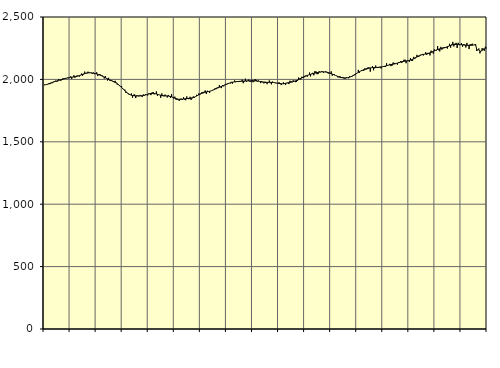
| Category | Piggar | Series 1 |
|---|---|---|
| nan | 1958.3 | 1954.32 |
| 87.0 | 1956.4 | 1957.07 |
| 87.0 | 1956.2 | 1959.35 |
| 87.0 | 1960.8 | 1962.17 |
| 87.0 | 1969.6 | 1965.12 |
| 87.0 | 1961.7 | 1968.23 |
| 87.0 | 1974.1 | 1971.53 |
| 87.0 | 1969.4 | 1974.83 |
| 87.0 | 1980.9 | 1978.11 |
| 87.0 | 1985.4 | 1981.26 |
| 87.0 | 1989.8 | 1984.26 |
| 87.0 | 1982.9 | 1987.09 |
| nan | 1983.1 | 1989.77 |
| 88.0 | 2001.6 | 1992.28 |
| 88.0 | 1995.8 | 1994.78 |
| 88.0 | 1988.4 | 1997.3 |
| 88.0 | 1997.2 | 1999.79 |
| 88.0 | 2007.8 | 2002.26 |
| 88.0 | 2002.4 | 2004.73 |
| 88.0 | 2011.5 | 2007.09 |
| 88.0 | 2008.2 | 2009.28 |
| 88.0 | 2012.8 | 2011.26 |
| 88.0 | 2008.5 | 2013.05 |
| 88.0 | 2018.4 | 2014.61 |
| nan | 2023.7 | 2016.04 |
| 89.0 | 2004 | 2017.41 |
| 89.0 | 2017.9 | 2018.68 |
| 89.0 | 2033.1 | 2019.99 |
| 89.0 | 2013.6 | 2021.51 |
| 89.0 | 2020.3 | 2023.23 |
| 89.0 | 2032.3 | 2025.25 |
| 89.0 | 2027.4 | 2027.64 |
| 89.0 | 2022 | 2030.4 |
| 89.0 | 2031.3 | 2033.53 |
| 89.0 | 2046.9 | 2036.91 |
| 89.0 | 2029.1 | 2040.39 |
| nan | 2038.7 | 2043.78 |
| 90.0 | 2062.3 | 2046.84 |
| 90.0 | 2047.5 | 2049.47 |
| 90.0 | 2046.9 | 2051.47 |
| 90.0 | 2061.7 | 2052.71 |
| 90.0 | 2050.5 | 2053.24 |
| 90.0 | 2052.7 | 2053.06 |
| 90.0 | 2055.3 | 2052.29 |
| 90.0 | 2043.9 | 2051.15 |
| 90.0 | 2055.2 | 2049.68 |
| 90.0 | 2041.8 | 2047.89 |
| 90.0 | 2043.8 | 2045.88 |
| nan | 2057.1 | 2043.63 |
| 91.0 | 2027 | 2041.04 |
| 91.0 | 2040.3 | 2038.09 |
| 91.0 | 2042.7 | 2034.79 |
| 91.0 | 2027.9 | 2031.12 |
| 91.0 | 2032 | 2027.12 |
| 91.0 | 2019.6 | 2022.8 |
| 91.0 | 2007 | 2018.23 |
| 91.0 | 2027 | 2013.58 |
| 91.0 | 2010 | 2009 |
| 91.0 | 1991.3 | 2004.57 |
| 91.0 | 2012.7 | 2000.39 |
| nan | 1991.3 | 1996.35 |
| 92.0 | 1987 | 1992.44 |
| 92.0 | 1991.8 | 1988.61 |
| 92.0 | 1982.3 | 1984.64 |
| 92.0 | 1978.1 | 1980.41 |
| 92.0 | 1988.7 | 1975.85 |
| 92.0 | 1975 | 1970.8 |
| 92.0 | 1958.6 | 1965.17 |
| 92.0 | 1962.2 | 1958.82 |
| 92.0 | 1946.3 | 1951.59 |
| 92.0 | 1945.2 | 1943.69 |
| 92.0 | 1944.6 | 1935.23 |
| nan | 1922.3 | 1926.34 |
| 93.0 | 1917 | 1917.45 |
| 93.0 | 1918.1 | 1908.83 |
| 93.0 | 1891.3 | 1900.7 |
| 93.0 | 1891.9 | 1893.31 |
| 93.0 | 1884.3 | 1886.78 |
| 93.0 | 1875 | 1881.2 |
| 93.0 | 1875.9 | 1876.76 |
| 93.0 | 1887.4 | 1873.41 |
| 93.0 | 1854 | 1871 |
| 93.0 | 1877.1 | 1869.33 |
| 93.0 | 1879.3 | 1868.19 |
| nan | 1850.5 | 1867.48 |
| 94.0 | 1872.2 | 1867.14 |
| 94.0 | 1870.7 | 1867.05 |
| 94.0 | 1865.3 | 1867.28 |
| 94.0 | 1875.4 | 1867.88 |
| 94.0 | 1865.8 | 1868.78 |
| 94.0 | 1858.6 | 1870.03 |
| 94.0 | 1879.1 | 1871.65 |
| 94.0 | 1869.3 | 1873.48 |
| 94.0 | 1881.2 | 1875.58 |
| 94.0 | 1879.6 | 1877.95 |
| 94.0 | 1871.5 | 1880.41 |
| nan | 1886.3 | 1882.92 |
| 95.0 | 1890.2 | 1885.25 |
| 95.0 | 1874 | 1887.01 |
| 95.0 | 1894.6 | 1888 |
| 95.0 | 1898 | 1888.06 |
| 95.0 | 1880 | 1887.17 |
| 95.0 | 1886.8 | 1885.56 |
| 95.0 | 1903.3 | 1883.33 |
| 95.0 | 1868.3 | 1880.68 |
| 95.0 | 1878.9 | 1877.94 |
| 95.0 | 1874.9 | 1875.23 |
| 95.0 | 1852.8 | 1872.8 |
| nan | 1887.3 | 1870.87 |
| 96.0 | 1875 | 1869.42 |
| 96.0 | 1864.4 | 1868.52 |
| 96.0 | 1878.6 | 1868.07 |
| 96.0 | 1867.3 | 1867.77 |
| 96.0 | 1855.3 | 1867.41 |
| 96.0 | 1875.5 | 1866.69 |
| 96.0 | 1861.4 | 1865.29 |
| 96.0 | 1851.9 | 1863.12 |
| 96.0 | 1882.4 | 1860.27 |
| 96.0 | 1859.6 | 1856.9 |
| 96.0 | 1847.4 | 1853.34 |
| nan | 1861.4 | 1849.78 |
| 97.0 | 1838.3 | 1846.39 |
| 97.0 | 1836.4 | 1843.5 |
| 97.0 | 1840 | 1841.3 |
| 97.0 | 1827.3 | 1840.01 |
| 97.0 | 1845.2 | 1839.74 |
| 97.0 | 1845.5 | 1840.3 |
| 97.0 | 1837.2 | 1841.43 |
| 97.0 | 1856.5 | 1842.87 |
| 97.0 | 1838.1 | 1844.3 |
| 97.0 | 1833.1 | 1845.47 |
| 97.0 | 1863.3 | 1846.36 |
| nan | 1849.2 | 1847.08 |
| 98.0 | 1841.6 | 1847.8 |
| 98.0 | 1860.3 | 1848.77 |
| 98.0 | 1835.2 | 1850.21 |
| 98.0 | 1848.3 | 1852.24 |
| 98.0 | 1863 | 1854.89 |
| 98.0 | 1852.8 | 1858.23 |
| 98.0 | 1861 | 1862.21 |
| 98.0 | 1876.6 | 1866.72 |
| 98.0 | 1869.4 | 1871.63 |
| 98.0 | 1887.2 | 1876.73 |
| 98.0 | 1874.4 | 1881.67 |
| nan | 1882.5 | 1886.12 |
| 99.0 | 1898.4 | 1889.95 |
| 99.0 | 1888.3 | 1893.1 |
| 99.0 | 1901.3 | 1895.59 |
| 99.0 | 1911 | 1897.61 |
| 99.0 | 1883.2 | 1899.29 |
| 99.0 | 1909 | 1900.79 |
| 99.0 | 1904.2 | 1902.43 |
| 99.0 | 1891.1 | 1904.51 |
| 99.0 | 1907.6 | 1907.11 |
| 99.0 | 1910.6 | 1910.3 |
| 99.0 | 1912 | 1913.99 |
| nan | 1918.7 | 1918.04 |
| 0.0 | 1927.5 | 1922.22 |
| 0.0 | 1921.6 | 1926.32 |
| 0.0 | 1935.1 | 1930.25 |
| 0.0 | 1930.2 | 1933.94 |
| 0.0 | 1953.4 | 1937.43 |
| 0.0 | 1936.1 | 1940.89 |
| 0.0 | 1930.2 | 1944.35 |
| 0.0 | 1954.4 | 1947.86 |
| 0.0 | 1943.8 | 1951.48 |
| 0.0 | 1956.9 | 1955.13 |
| 0.0 | 1963.8 | 1958.79 |
| nan | 1961.4 | 1962.41 |
| 1.0 | 1970.1 | 1965.92 |
| 1.0 | 1969.5 | 1969.22 |
| 1.0 | 1968.7 | 1972.19 |
| 1.0 | 1980.4 | 1974.8 |
| 1.0 | 1965.7 | 1977.06 |
| 1.0 | 1978.4 | 1978.88 |
| 1.0 | 1991.3 | 1980.41 |
| 1.0 | 1977.7 | 1981.66 |
| 1.0 | 1985.4 | 1982.59 |
| 1.0 | 1986.1 | 1983.32 |
| 1.0 | 1980 | 1983.94 |
| nan | 1981.8 | 1984.48 |
| 2.0 | 1984.2 | 1985.04 |
| 2.0 | 1997.1 | 1985.66 |
| 2.0 | 1969.4 | 1986.26 |
| 2.0 | 1981.4 | 1986.77 |
| 2.0 | 2005.4 | 1987.22 |
| 2.0 | 1979.9 | 1987.62 |
| 2.0 | 1990.2 | 1987.92 |
| 2.0 | 1998.3 | 1988.2 |
| 2.0 | 1982.1 | 1988.49 |
| 2.0 | 1980.3 | 1988.72 |
| 2.0 | 1996.7 | 1988.92 |
| nan | 1977.1 | 1989.02 |
| 3.0 | 1983.6 | 1988.92 |
| 3.0 | 2002.3 | 1988.61 |
| 3.0 | 1995.8 | 1988.04 |
| 3.0 | 1982.4 | 1987.12 |
| 3.0 | 1991.3 | 1985.77 |
| 3.0 | 1982.4 | 1984.03 |
| 3.0 | 1970.4 | 1982.08 |
| 3.0 | 1986.8 | 1980.11 |
| 3.0 | 1982 | 1978.34 |
| 3.0 | 1967.9 | 1977.02 |
| 3.0 | 1981.9 | 1976.22 |
| nan | 1978 | 1975.93 |
| 4.0 | 1962 | 1976.01 |
| 4.0 | 1975.2 | 1976.23 |
| 4.0 | 1991.2 | 1976.43 |
| 4.0 | 1969.9 | 1976.51 |
| 4.0 | 1960.2 | 1976.31 |
| 4.0 | 1982.6 | 1975.72 |
| 4.0 | 1972.2 | 1974.82 |
| 4.0 | 1975.3 | 1973.61 |
| 4.0 | 1969.7 | 1972.08 |
| 4.0 | 1969.5 | 1970.45 |
| 4.0 | 1966.3 | 1968.82 |
| nan | 1977 | 1967.29 |
| 5.0 | 1963.9 | 1966.07 |
| 5.0 | 1954.7 | 1965.3 |
| 5.0 | 1965.1 | 1965 |
| 5.0 | 1977 | 1965.3 |
| 5.0 | 1963.9 | 1966.31 |
| 5.0 | 1955.8 | 1967.92 |
| 5.0 | 1972.5 | 1969.88 |
| 5.0 | 1974.9 | 1972 |
| 5.0 | 1962.4 | 1974.2 |
| 5.0 | 1989.3 | 1976.36 |
| 5.0 | 1984.2 | 1978.48 |
| nan | 1976.4 | 1980.6 |
| 6.0 | 1993.1 | 1982.8 |
| 6.0 | 1984.4 | 1985.21 |
| 6.0 | 1978.2 | 1987.97 |
| 6.0 | 1979.5 | 1991.1 |
| 6.0 | 1988.9 | 1994.58 |
| 6.0 | 2014.5 | 1998.54 |
| 6.0 | 2006.2 | 2002.93 |
| 6.0 | 1999.5 | 2007.52 |
| 6.0 | 2021.7 | 2012.21 |
| 6.0 | 2011.8 | 2016.75 |
| 6.0 | 2016.9 | 2020.87 |
| nan | 2029.5 | 2024.65 |
| 7.0 | 2032.3 | 2028.22 |
| 7.0 | 2022.3 | 2031.57 |
| 7.0 | 2034.7 | 2034.82 |
| 7.0 | 2054.9 | 2037.95 |
| 7.0 | 2023.9 | 2040.88 |
| 7.0 | 2045.3 | 2043.57 |
| 7.0 | 2052.6 | 2045.99 |
| 7.0 | 2032.6 | 2048.24 |
| 7.0 | 2066 | 2050.36 |
| 7.0 | 2063.6 | 2052.36 |
| 7.0 | 2041.5 | 2054.33 |
| nan | 2042.9 | 2056.21 |
| 8.0 | 2065.2 | 2057.81 |
| 8.0 | 2057.4 | 2059.13 |
| 8.0 | 2065.2 | 2060.1 |
| 8.0 | 2063.5 | 2060.58 |
| 8.0 | 2053.1 | 2060.54 |
| 8.0 | 2059.4 | 2060.03 |
| 8.0 | 2064.5 | 2058.95 |
| 8.0 | 2060.2 | 2057.33 |
| 8.0 | 2049.3 | 2055.14 |
| 8.0 | 2046.4 | 2052.4 |
| 8.0 | 2046.6 | 2049.3 |
| nan | 2064.5 | 2045.97 |
| 9.0 | 2029.8 | 2042.46 |
| 9.0 | 2041.6 | 2038.81 |
| 9.0 | 2040.2 | 2035.07 |
| 9.0 | 2031.6 | 2031.3 |
| 9.0 | 2029.5 | 2027.63 |
| 9.0 | 2017.3 | 2024.13 |
| 9.0 | 2016.9 | 2020.86 |
| 9.0 | 2026.6 | 2017.96 |
| 9.0 | 2011.1 | 2015.56 |
| 9.0 | 2014.3 | 2013.75 |
| 9.0 | 2018.8 | 2012.56 |
| nan | 2005.6 | 2011.97 |
| 10.0 | 2006.6 | 2011.96 |
| 10.0 | 2017.7 | 2012.53 |
| 10.0 | 2014.8 | 2013.67 |
| 10.0 | 2009.1 | 2015.48 |
| 10.0 | 2025.7 | 2018.01 |
| 10.0 | 2021.4 | 2021.27 |
| 10.0 | 2019.9 | 2025.29 |
| 10.0 | 2033 | 2029.9 |
| 10.0 | 2033.1 | 2034.96 |
| 10.0 | 2034 | 2040.37 |
| 10.0 | 2043.7 | 2045.87 |
| nan | 2050.6 | 2051.3 |
| 11.0 | 2076.4 | 2056.55 |
| 11.0 | 2053.3 | 2061.49 |
| 11.0 | 2065.6 | 2066 |
| 11.0 | 2075.3 | 2070.21 |
| 11.0 | 2071.7 | 2074.16 |
| 11.0 | 2068.5 | 2077.74 |
| 11.0 | 2088.4 | 2080.93 |
| 11.0 | 2078.9 | 2083.8 |
| 11.0 | 2081.8 | 2086.35 |
| 11.0 | 2097.4 | 2088.58 |
| 11.0 | 2093.1 | 2090.53 |
| nan | 2062.1 | 2092.14 |
| 12.0 | 2092.9 | 2093.33 |
| 12.0 | 2105.8 | 2094.13 |
| 12.0 | 2073.1 | 2094.75 |
| 12.0 | 2088.5 | 2095.12 |
| 12.0 | 2110.8 | 2095.35 |
| 12.0 | 2099.4 | 2095.63 |
| 12.0 | 2091.7 | 2096.05 |
| 12.0 | 2098.6 | 2096.75 |
| 12.0 | 2102.2 | 2097.89 |
| 12.0 | 2087.7 | 2099.36 |
| 12.0 | 2101.6 | 2101.01 |
| nan | 2105.6 | 2102.88 |
| 13.0 | 2099.9 | 2104.94 |
| 13.0 | 2098.9 | 2107.25 |
| 13.0 | 2129.1 | 2109.71 |
| 13.0 | 2109.5 | 2112.26 |
| 13.0 | 2113.8 | 2114.61 |
| 13.0 | 2124.6 | 2116.69 |
| 13.0 | 2106.3 | 2118.57 |
| 13.0 | 2109.6 | 2120.27 |
| 13.0 | 2134.6 | 2121.84 |
| 13.0 | 2132.3 | 2123.57 |
| 13.0 | 2122.9 | 2125.61 |
| nan | 2126.7 | 2127.95 |
| 14.0 | 2117.9 | 2130.61 |
| 14.0 | 2138.4 | 2133.43 |
| 14.0 | 2132.7 | 2136.23 |
| 14.0 | 2147.4 | 2138.89 |
| 14.0 | 2131.2 | 2141.31 |
| 14.0 | 2147 | 2143.43 |
| 14.0 | 2157 | 2145.25 |
| 14.0 | 2158 | 2146.75 |
| 14.0 | 2129.6 | 2148 |
| 14.0 | 2151.3 | 2149.14 |
| 14.0 | 2152.9 | 2150.48 |
| nan | 2140.7 | 2152.29 |
| 15.0 | 2169.8 | 2154.74 |
| 15.0 | 2149.6 | 2157.93 |
| 15.0 | 2149.4 | 2161.81 |
| 15.0 | 2180.5 | 2166.19 |
| 15.0 | 2162.9 | 2170.91 |
| 15.0 | 2172.7 | 2175.78 |
| 15.0 | 2196.7 | 2180.49 |
| 15.0 | 2179.1 | 2184.97 |
| 15.0 | 2183.9 | 2189.08 |
| 15.0 | 2197.2 | 2192.72 |
| 15.0 | 2196.7 | 2195.84 |
| nan | 2203.7 | 2198.41 |
| 16.0 | 2191.9 | 2200.51 |
| 16.0 | 2201.8 | 2202.28 |
| 16.0 | 2217.9 | 2203.86 |
| 16.0 | 2196.3 | 2205.48 |
| 16.0 | 2212.9 | 2207.43 |
| 16.0 | 2208.9 | 2209.87 |
| 16.0 | 2192.4 | 2212.84 |
| 16.0 | 2230.2 | 2216.29 |
| 16.0 | 2222.4 | 2220.15 |
| 16.0 | 2206.7 | 2224.21 |
| 16.0 | 2241.3 | 2228.29 |
| nan | 2230.6 | 2232.32 |
| 17.0 | 2232.4 | 2236.12 |
| 17.0 | 2266.7 | 2239.48 |
| 17.0 | 2233.3 | 2242.35 |
| 17.0 | 2224.6 | 2244.74 |
| 17.0 | 2260.6 | 2246.72 |
| 17.0 | 2238.6 | 2248.55 |
| 17.0 | 2255.4 | 2250.49 |
| 17.0 | 2259.4 | 2252.69 |
| 17.0 | 2257.4 | 2255.33 |
| 17.0 | 2255 | 2258.46 |
| 17.0 | 2247 | 2262 |
| nan | 2263.5 | 2265.65 |
| 18.0 | 2285.5 | 2269.17 |
| 18.0 | 2254.5 | 2272.4 |
| 18.0 | 2280.8 | 2275.18 |
| 18.0 | 2300.6 | 2277.51 |
| 18.0 | 2264.2 | 2279.35 |
| 18.0 | 2286.3 | 2280.47 |
| 18.0 | 2292.8 | 2280.9 |
| 18.0 | 2251.8 | 2280.83 |
| 18.0 | 2293.2 | 2280.38 |
| 18.0 | 2274.5 | 2279.65 |
| 18.0 | 2281 | 2278.69 |
| nan | 2290.5 | 2277.62 |
| 19.0 | 2262.3 | 2276.49 |
| 19.0 | 2282.1 | 2275.42 |
| 19.0 | 2280 | 2274.57 |
| 19.0 | 2255.7 | 2273.87 |
| 19.0 | 2292.1 | 2273.28 |
| 19.0 | 2275.4 | 2272.97 |
| 19.0 | 2243 | 2272.85 |
| 19.0 | 2280.8 | 2272.94 |
| 19.0 | 2282.6 | 2273.32 |
| 19.0 | 2286.1 | 2274.06 |
| 19.0 | 2275 | 2275.34 |
| nan | 2275.2 | 2277.28 |
| 20.0 | 2274.2 | 2280.07 |
| 20.0 | 2228.9 | 2239.85 |
| 20.0 | 2233 | 2235.53 |
| 20.0 | 2247.7 | 2240.87 |
| 20.0 | 2208.6 | 2220.79 |
| 20.0 | 2229.2 | 2227.02 |
| 20.0 | 2249.8 | 2233.36 |
| 20.0 | 2246.1 | 2239.48 |
| 20.0 | 2229 | 2244.93 |
| 20.0 | 2262.1 | 2249.57 |
| 20.0 | 2249.8 | 2253.44 |